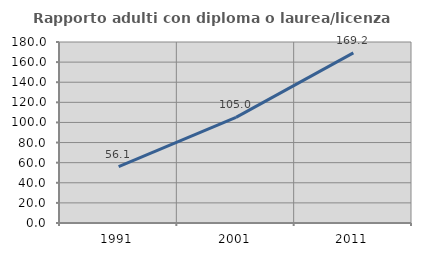
| Category | Rapporto adulti con diploma o laurea/licenza media  |
|---|---|
| 1991.0 | 56.105 |
| 2001.0 | 105.038 |
| 2011.0 | 169.231 |